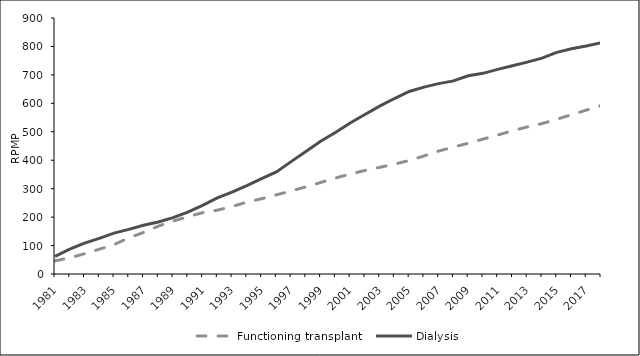
| Category | Functioning transplant | Dialysis |
|---|---|---|
| 0 | 46.3 | 61.7 |
| 1 | 56.7 | 87.7 |
| 2 | 71.3 | 108.6 |
| 3 | 86.9 | 125.2 |
| 4 | 103.4 | 143.7 |
| 5 | 127 | 156.8 |
| 6 | 146.3 | 171.4 |
| 7 | 168.2 | 182.7 |
| 8 | 185.8 | 198.3 |
| 9 | 201.6 | 217.4 |
| 10 | 215.5 | 241.2 |
| 11 | 224.4 | 267.6 |
| 12 | 237.2 | 288.1 |
| 13 | 252.7 | 310.7 |
| 14 | 264.6 | 335 |
| 15 | 278.3 | 359 |
| 16 | 291.9 | 395.1 |
| 17 | 306.3 | 430.5 |
| 18 | 321.6 | 466.8 |
| 19 | 337.4 | 497.2 |
| 20 | 351.4 | 531 |
| 21 | 363.8 | 560.5 |
| 22 | 375 | 590 |
| 23 | 386.4 | 616.9 |
| 24 | 399 | 641.8 |
| 25 | 414.9 | 657.1 |
| 26 | 432.3 | 669.3 |
| 27 | 446.2 | 678.8 |
| 28 | 459.5 | 697 |
| 29 | 474.2 | 705.4 |
| 30 | 488.4 | 719.3 |
| 31 | 503.7 | 732.4 |
| 32 | 516.9 | 744.9 |
| 33 | 528.8 | 758.9 |
| 34 | 543.8 | 779.3 |
| 35 | 560.1 | 791.6 |
| 36 | 576 | 801.3 |
| 37 | 592.4 | 812.9 |